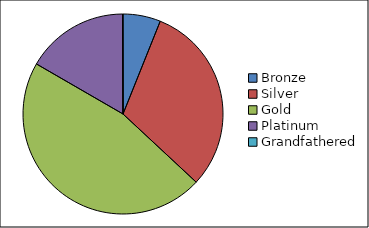
| Category | Series 0 |
|---|---|
| Bronze | 9332 |
| Silver | 47423 |
| Gold | 71313 |
| Platinum | 25488 |
| Grandfathered | 111 |